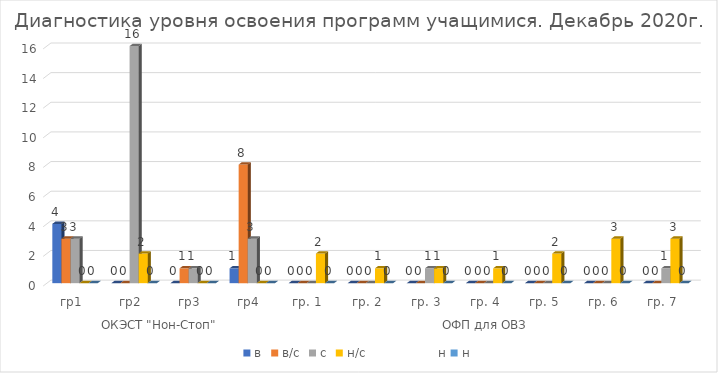
| Category | в | в/с | с | н/с                  н | н |
|---|---|---|---|---|---|
| 0 | 4 | 3 | 3 | 0 | 0 |
| 1 | 0 | 0 | 16 | 2 | 0 |
| 2 | 0 | 1 | 1 | 0 | 0 |
| 3 | 1 | 8 | 3 | 0 | 0 |
| 4 | 0 | 0 | 0 | 2 | 0 |
| 5 | 0 | 0 | 0 | 1 | 0 |
| 6 | 0 | 0 | 1 | 1 | 0 |
| 7 | 0 | 0 | 0 | 1 | 0 |
| 8 | 0 | 0 | 0 | 2 | 0 |
| 9 | 0 | 0 | 0 | 3 | 0 |
| 10 | 0 | 0 | 1 | 3 | 0 |